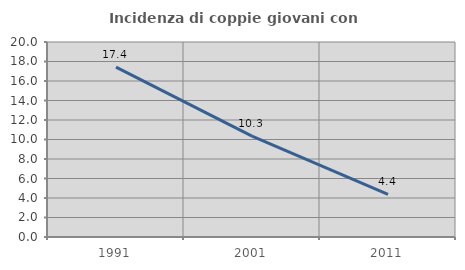
| Category | Incidenza di coppie giovani con figli |
|---|---|
| 1991.0 | 17.427 |
| 2001.0 | 10.345 |
| 2011.0 | 4.371 |